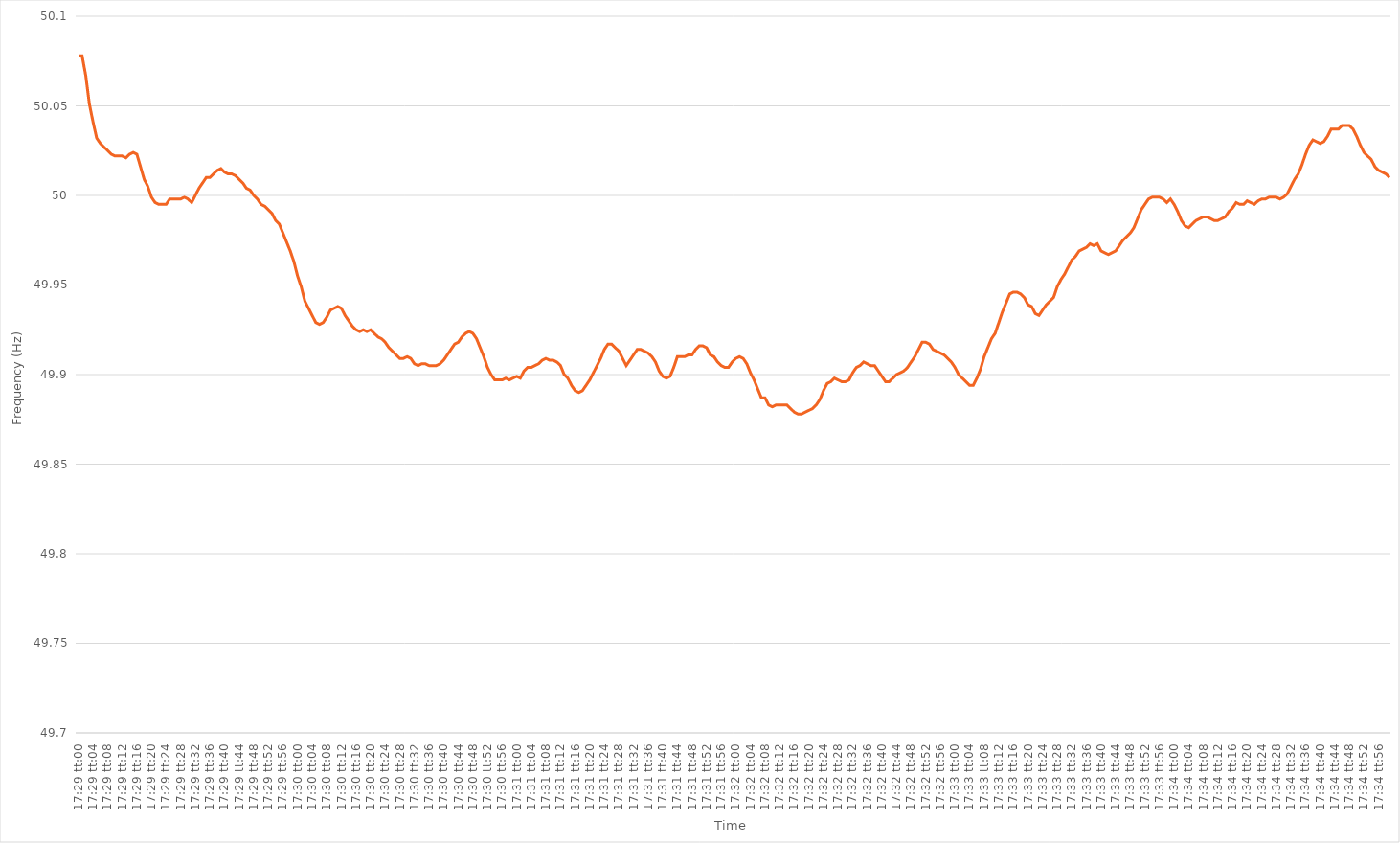
| Category | Series 0 |
|---|---|
| 0.7284722222222223 | 50.078 |
| 0.7284837962962962 | 50.078 |
| 0.7284953703703704 | 50.067 |
| 0.7285069444444444 | 50.051 |
| 0.7285185185185186 | 50.041 |
| 0.7285300925925925 | 50.032 |
| 0.7285416666666666 | 50.029 |
| 0.7285532407407408 | 50.027 |
| 0.7285648148148148 | 50.025 |
| 0.7285763888888889 | 50.023 |
| 0.7285879629629629 | 50.022 |
| 0.7285995370370371 | 50.022 |
| 0.7286111111111112 | 50.022 |
| 0.7286226851851851 | 50.021 |
| 0.7286342592592593 | 50.023 |
| 0.7286458333333333 | 50.024 |
| 0.7286574074074075 | 50.023 |
| 0.7286689814814814 | 50.016 |
| 0.7286805555555556 | 50.009 |
| 0.7286921296296297 | 50.005 |
| 0.7287037037037036 | 49.999 |
| 0.7287152777777778 | 49.996 |
| 0.7287268518518518 | 49.995 |
| 0.728738425925926 | 49.995 |
| 0.7287499999999999 | 49.995 |
| 0.728761574074074 | 49.998 |
| 0.7287731481481482 | 49.998 |
| 0.7287847222222222 | 49.998 |
| 0.7287962962962963 | 49.998 |
| 0.7288078703703703 | 49.999 |
| 0.7288194444444445 | 49.998 |
| 0.7288310185185186 | 49.996 |
| 0.7288425925925925 | 50 |
| 0.7288541666666667 | 50.004 |
| 0.7288657407407407 | 50.007 |
| 0.7288773148148149 | 50.01 |
| 0.7288888888888888 | 50.01 |
| 0.728900462962963 | 50.012 |
| 0.7289120370370371 | 50.014 |
| 0.728923611111111 | 50.015 |
| 0.7289351851851852 | 50.013 |
| 0.7289467592592592 | 50.012 |
| 0.7289583333333334 | 50.012 |
| 0.7289699074074073 | 50.011 |
| 0.7289814814814815 | 50.009 |
| 0.7289930555555556 | 50.007 |
| 0.7290046296296296 | 50.004 |
| 0.7290162037037037 | 50.003 |
| 0.7290277777777777 | 50 |
| 0.7290393518518519 | 49.998 |
| 0.729050925925926 | 49.995 |
| 0.7290625 | 49.994 |
| 0.7290740740740741 | 49.992 |
| 0.7290856481481481 | 49.99 |
| 0.7290972222222223 | 49.986 |
| 0.7291087962962962 | 49.984 |
| 0.7291203703703704 | 49.979 |
| 0.7291319444444445 | 49.974 |
| 0.7291435185185186 | 49.969 |
| 0.7291550925925926 | 49.963 |
| 0.7291666666666666 | 49.955 |
| 0.7291782407407408 | 49.949 |
| 0.7291898148148147 | 49.941 |
| 0.7292013888888889 | 49.937 |
| 0.729212962962963 | 49.933 |
| 0.729224537037037 | 49.929 |
| 0.7292361111111111 | 49.928 |
| 0.7292476851851851 | 49.929 |
| 0.7292592592592593 | 49.932 |
| 0.7292708333333334 | 49.936 |
| 0.7292824074074074 | 49.937 |
| 0.7292939814814815 | 49.938 |
| 0.7293055555555555 | 49.937 |
| 0.7293171296296297 | 49.933 |
| 0.7293287037037036 | 49.93 |
| 0.7293402777777778 | 49.927 |
| 0.7293518518518519 | 49.925 |
| 0.729363425925926 | 49.924 |
| 0.729375 | 49.925 |
| 0.729386574074074 | 49.924 |
| 0.7293981481481482 | 49.925 |
| 0.7294097222222223 | 49.923 |
| 0.7294212962962963 | 49.921 |
| 0.7294328703703704 | 49.92 |
| 0.7294444444444445 | 49.918 |
| 0.7294560185185185 | 49.915 |
| 0.7294675925925925 | 49.913 |
| 0.7294791666666667 | 49.911 |
| 0.7294907407407408 | 49.909 |
| 0.7295023148148148 | 49.909 |
| 0.7295138888888889 | 49.91 |
| 0.729525462962963 | 49.909 |
| 0.7295370370370371 | 49.906 |
| 0.729548611111111 | 49.905 |
| 0.7295601851851852 | 49.906 |
| 0.7295717592592593 | 49.906 |
| 0.7295833333333334 | 49.905 |
| 0.7295949074074074 | 49.905 |
| 0.7296064814814814 | 49.905 |
| 0.7296180555555556 | 49.906 |
| 0.7296296296296297 | 49.908 |
| 0.7296412037037037 | 49.911 |
| 0.7296527777777778 | 49.914 |
| 0.7296643518518519 | 49.917 |
| 0.7296759259259259 | 49.918 |
| 0.7296874999999999 | 49.921 |
| 0.7296990740740741 | 49.923 |
| 0.7297106481481482 | 49.924 |
| 0.7297222222222222 | 49.923 |
| 0.7297337962962963 | 49.92 |
| 0.7297453703703703 | 49.915 |
| 0.7297569444444445 | 49.91 |
| 0.7297685185185184 | 49.904 |
| 0.7297800925925926 | 49.9 |
| 0.7297916666666667 | 49.897 |
| 0.7298032407407408 | 49.897 |
| 0.7298148148148148 | 49.897 |
| 0.7298263888888888 | 49.898 |
| 0.729837962962963 | 49.897 |
| 0.7298495370370371 | 49.898 |
| 0.7298611111111111 | 49.899 |
| 0.7298726851851852 | 49.898 |
| 0.7298842592592593 | 49.902 |
| 0.7298958333333333 | 49.904 |
| 0.7299074074074073 | 49.904 |
| 0.7299189814814815 | 49.905 |
| 0.7299305555555556 | 49.906 |
| 0.7299421296296296 | 49.908 |
| 0.7299537037037037 | 49.909 |
| 0.7299652777777778 | 49.908 |
| 0.7299768518518519 | 49.908 |
| 0.7299884259259258 | 49.907 |
| 0.73 | 49.905 |
| 0.7300115740740741 | 49.9 |
| 0.7300231481481482 | 49.898 |
| 0.7300347222222222 | 49.894 |
| 0.7300462962962962 | 49.891 |
| 0.7300578703703704 | 49.89 |
| 0.7300694444444445 | 49.891 |
| 0.7300810185185185 | 49.894 |
| 0.7300925925925926 | 49.897 |
| 0.7301041666666667 | 49.901 |
| 0.7301157407407407 | 49.905 |
| 0.7301273148148147 | 49.909 |
| 0.7301388888888889 | 49.914 |
| 0.730150462962963 | 49.917 |
| 0.730162037037037 | 49.917 |
| 0.7301736111111111 | 49.915 |
| 0.7301851851851852 | 49.913 |
| 0.7301967592592593 | 49.909 |
| 0.7302083333333332 | 49.905 |
| 0.7302199074074074 | 49.908 |
| 0.7302314814814815 | 49.911 |
| 0.7302430555555556 | 49.914 |
| 0.7302546296296296 | 49.914 |
| 0.7302662037037037 | 49.913 |
| 0.7302777777777778 | 49.912 |
| 0.730289351851852 | 49.91 |
| 0.7303009259259259 | 49.907 |
| 0.7303125 | 49.902 |
| 0.7303240740740741 | 49.899 |
| 0.7303356481481482 | 49.898 |
| 0.7303472222222221 | 49.899 |
| 0.7303587962962963 | 49.904 |
| 0.7303703703703704 | 49.91 |
| 0.7303819444444444 | 49.91 |
| 0.7303935185185185 | 49.91 |
| 0.7304050925925926 | 49.911 |
| 0.7304166666666667 | 49.911 |
| 0.7304282407407406 | 49.914 |
| 0.7304398148148148 | 49.916 |
| 0.7304513888888889 | 49.916 |
| 0.730462962962963 | 49.915 |
| 0.730474537037037 | 49.911 |
| 0.7304861111111111 | 49.91 |
| 0.7304976851851852 | 49.907 |
| 0.7305092592592594 | 49.905 |
| 0.7305208333333333 | 49.904 |
| 0.7305324074074074 | 49.904 |
| 0.7305439814814815 | 49.907 |
| 0.7305555555555556 | 49.909 |
| 0.7305671296296296 | 49.91 |
| 0.7305787037037037 | 49.909 |
| 0.7305902777777779 | 49.906 |
| 0.7306018518518519 | 49.901 |
| 0.7306134259259259 | 49.897 |
| 0.730625 | 49.892 |
| 0.7306365740740741 | 49.887 |
| 0.730648148148148 | 49.887 |
| 0.7306597222222222 | 49.883 |
| 0.7306712962962963 | 49.882 |
| 0.7306828703703704 | 49.883 |
| 0.7306944444444444 | 49.883 |
| 0.7307060185185185 | 49.883 |
| 0.7307175925925926 | 49.883 |
| 0.7307291666666668 | 49.881 |
| 0.7307407407407407 | 49.879 |
| 0.7307523148148148 | 49.878 |
| 0.7307638888888889 | 49.878 |
| 0.730775462962963 | 49.879 |
| 0.730787037037037 | 49.88 |
| 0.7307986111111111 | 49.881 |
| 0.7308101851851853 | 49.883 |
| 0.7308217592592593 | 49.886 |
| 0.7308333333333333 | 49.891 |
| 0.7308449074074074 | 49.895 |
| 0.7308564814814815 | 49.896 |
| 0.7308680555555555 | 49.898 |
| 0.7308796296296296 | 49.897 |
| 0.7308912037037038 | 49.896 |
| 0.7309027777777778 | 49.896 |
| 0.7309143518518518 | 49.897 |
| 0.7309259259259259 | 49.901 |
| 0.7309375 | 49.904 |
| 0.7309490740740742 | 49.905 |
| 0.7309606481481481 | 49.907 |
| 0.7309722222222222 | 49.906 |
| 0.7309837962962963 | 49.905 |
| 0.7309953703703704 | 49.905 |
| 0.7310069444444444 | 49.902 |
| 0.7310185185185185 | 49.899 |
| 0.7310300925925927 | 49.896 |
| 0.7310416666666667 | 49.896 |
| 0.7310532407407407 | 49.898 |
| 0.7310648148148148 | 49.9 |
| 0.7310763888888889 | 49.901 |
| 0.7310879629629629 | 49.902 |
| 0.731099537037037 | 49.904 |
| 0.7311111111111112 | 49.907 |
| 0.7311226851851852 | 49.91 |
| 0.7311342592592592 | 49.914 |
| 0.7311458333333333 | 49.918 |
| 0.7311574074074074 | 49.918 |
| 0.7311689814814816 | 49.917 |
| 0.7311805555555555 | 49.914 |
| 0.7311921296296297 | 49.913 |
| 0.7312037037037037 | 49.912 |
| 0.7312152777777778 | 49.911 |
| 0.7312268518518518 | 49.909 |
| 0.7312384259259259 | 49.907 |
| 0.7312500000000001 | 49.904 |
| 0.7312615740740741 | 49.9 |
| 0.7312731481481481 | 49.898 |
| 0.7312847222222222 | 49.896 |
| 0.7312962962962963 | 49.894 |
| 0.7313078703703703 | 49.894 |
| 0.7313194444444444 | 49.898 |
| 0.7313310185185186 | 49.903 |
| 0.7313425925925926 | 49.91 |
| 0.7313541666666666 | 49.915 |
| 0.7313657407407407 | 49.92 |
| 0.7313773148148148 | 49.923 |
| 0.731388888888889 | 49.929 |
| 0.7314004629629629 | 49.935 |
| 0.731412037037037 | 49.94 |
| 0.7314236111111111 | 49.945 |
| 0.7314351851851852 | 49.946 |
| 0.7314467592592592 | 49.946 |
| 0.7314583333333333 | 49.945 |
| 0.7314699074074075 | 49.943 |
| 0.7314814814814815 | 49.939 |
| 0.7314930555555555 | 49.938 |
| 0.7315046296296296 | 49.934 |
| 0.7315162037037037 | 49.933 |
| 0.7315277777777777 | 49.936 |
| 0.7315393518518518 | 49.939 |
| 0.731550925925926 | 49.941 |
| 0.7315625 | 49.943 |
| 0.731574074074074 | 49.949 |
| 0.7315856481481481 | 49.953 |
| 0.7315972222222222 | 49.956 |
| 0.7316087962962964 | 49.96 |
| 0.7316203703703703 | 49.964 |
| 0.7316319444444445 | 49.966 |
| 0.7316435185185185 | 49.969 |
| 0.7316550925925926 | 49.97 |
| 0.7316666666666666 | 49.971 |
| 0.7316782407407407 | 49.973 |
| 0.7316898148148149 | 49.972 |
| 0.7317013888888889 | 49.973 |
| 0.731712962962963 | 49.969 |
| 0.731724537037037 | 49.968 |
| 0.7317361111111111 | 49.967 |
| 0.7317476851851853 | 49.968 |
| 0.7317592592592592 | 49.969 |
| 0.7317708333333334 | 49.972 |
| 0.7317824074074074 | 49.975 |
| 0.7317939814814814 | 49.977 |
| 0.7318055555555555 | 49.979 |
| 0.7318171296296296 | 49.982 |
| 0.7318287037037038 | 49.987 |
| 0.7318402777777777 | 49.992 |
| 0.7318518518518519 | 49.995 |
| 0.7318634259259259 | 49.998 |
| 0.731875 | 49.999 |
| 0.731886574074074 | 49.999 |
| 0.7318981481481481 | 49.999 |
| 0.7319097222222223 | 49.998 |
| 0.7319212962962963 | 49.996 |
| 0.7319328703703704 | 49.998 |
| 0.7319444444444444 | 49.995 |
| 0.7319560185185185 | 49.991 |
| 0.7319675925925927 | 49.986 |
| 0.7319791666666666 | 49.983 |
| 0.7319907407407408 | 49.982 |
| 0.7320023148148148 | 49.984 |
| 0.732013888888889 | 49.986 |
| 0.7320254629629629 | 49.987 |
| 0.732037037037037 | 49.988 |
| 0.7320486111111112 | 49.988 |
| 0.7320601851851851 | 49.987 |
| 0.7320717592592593 | 49.986 |
| 0.7320833333333333 | 49.986 |
| 0.7320949074074075 | 49.987 |
| 0.7321064814814814 | 49.988 |
| 0.7321180555555555 | 49.991 |
| 0.7321296296296297 | 49.993 |
| 0.7321412037037037 | 49.996 |
| 0.7321527777777778 | 49.995 |
| 0.7321643518518518 | 49.995 |
| 0.732175925925926 | 49.997 |
| 0.7321875000000001 | 49.996 |
| 0.732199074074074 | 49.995 |
| 0.7322106481481482 | 49.997 |
| 0.7322222222222222 | 49.998 |
| 0.7322337962962964 | 49.998 |
| 0.7322453703703703 | 49.999 |
| 0.7322569444444444 | 49.999 |
| 0.7322685185185186 | 49.999 |
| 0.7322800925925925 | 49.998 |
| 0.7322916666666667 | 49.999 |
| 0.7323032407407407 | 50.001 |
| 0.7323148148148149 | 50.005 |
| 0.7323263888888888 | 50.009 |
| 0.7323379629629629 | 50.012 |
| 0.7323495370370371 | 50.017 |
| 0.7323611111111111 | 50.023 |
| 0.7323726851851852 | 50.028 |
| 0.7323842592592592 | 50.031 |
| 0.7323958333333334 | 50.03 |
| 0.7324074074074075 | 50.029 |
| 0.7324189814814814 | 50.03 |
| 0.7324305555555556 | 50.033 |
| 0.7324421296296296 | 50.037 |
| 0.7324537037037038 | 50.037 |
| 0.7324652777777777 | 50.037 |
| 0.7324768518518519 | 50.039 |
| 0.732488425925926 | 50.039 |
| 0.7324999999999999 | 50.039 |
| 0.7325115740740741 | 50.037 |
| 0.7325231481481481 | 50.033 |
| 0.7325347222222223 | 50.028 |
| 0.7325462962962962 | 50.024 |
| 0.7325578703703703 | 50.022 |
| 0.7325694444444445 | 50.02 |
| 0.7325810185185185 | 50.016 |
| 0.7325925925925926 | 50.014 |
| 0.7326041666666666 | 50.013 |
| 0.7326157407407408 | 50.012 |
| 0.7326273148148149 | 50.01 |